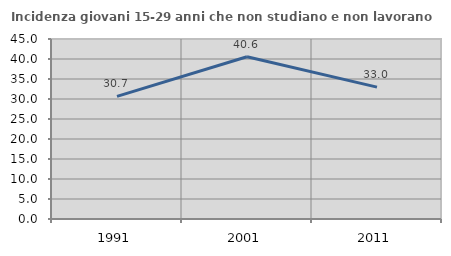
| Category | Incidenza giovani 15-29 anni che non studiano e non lavorano  |
|---|---|
| 1991.0 | 30.66 |
| 2001.0 | 40.576 |
| 2011.0 | 32.961 |